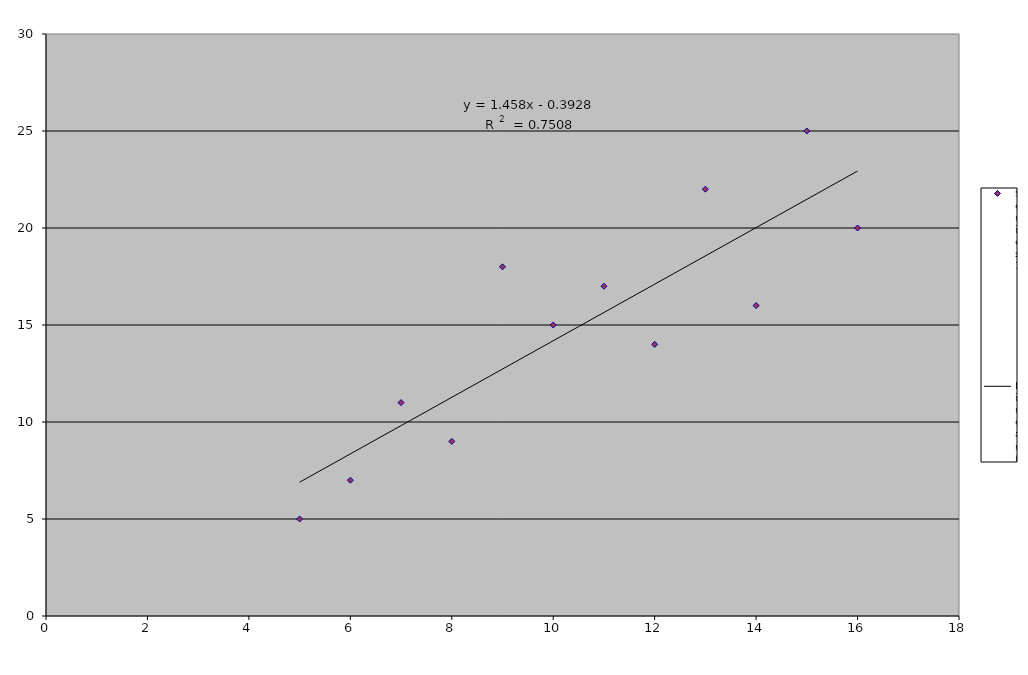
| Category | Series 0 |
|---|---|
| 5.0 | 5 |
| 6.0 | 7 |
| 7.0 | 11 |
| 8.0 | 9 |
| 9.0 | 18 |
| 10.0 | 15 |
| 11.0 | 17 |
| 12.0 | 14 |
| 13.0 | 22 |
| 14.0 | 16 |
| 15.0 | 25 |
| 16.0 | 20 |